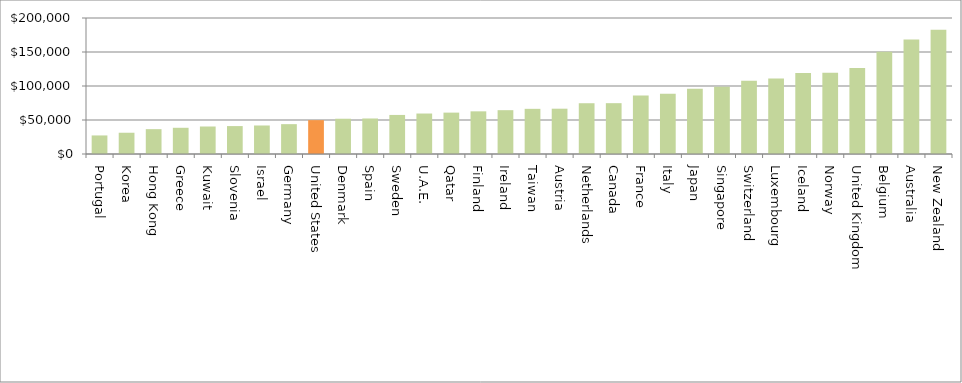
| Category | Series 0 |
|---|---|
| Portugal | 27297 |
| Korea | 31259 |
| Hong Kong | 36545 |
| Greece | 38552 |
| Kuwait | 40438 |
| Slovenia | 41061 |
| Israel | 41926 |
| Germany | 43898 |
| United States | 49787 |
| Denmark | 51854 |
| Spain | 52223 |
| Sweden | 57433 |
| U.A.E. | 59518 |
| Qatar | 60846 |
| Finland | 62729 |
| Ireland | 64444 |
| Taiwan | 66423 |
| Austria | 66617 |
| Netherlands | 74659 |
| Canada | 74750 |
| France | 86156 |
| Italy | 88603 |
| Japan | 96071 |
| Singapore | 98922 |
| Switzerland | 107583 |
| Luxembourg | 110885 |
| Iceland | 118947 |
| Norway | 119634 |
| United Kingdom | 126472 |
| Belgium | 150348 |
| Australia | 168291 |
| New Zealand | 182618 |